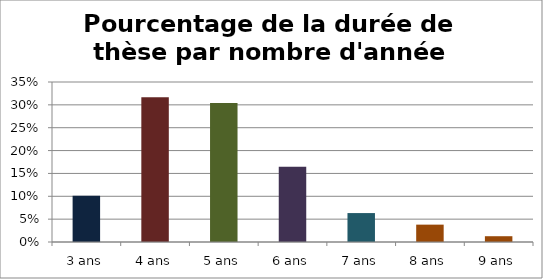
| Category | Pourcentage de la durés du thèse par nombre d'année |
|---|---|
| 3 ans | 0.101 |
| 4 ans | 0.316 |
| 5 ans | 0.304 |
| 6 ans | 0.165 |
| 7 ans | 0.063 |
| 8 ans | 0.038 |
| 9 ans | 0.013 |